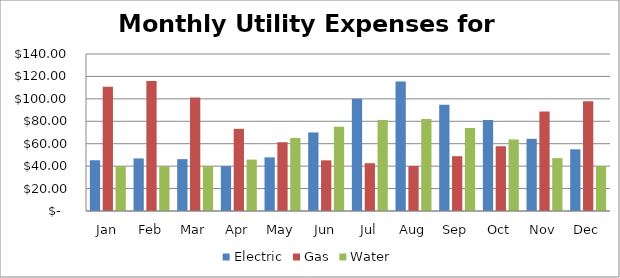
| Category | Electric | Gas | Water |
|---|---|---|---|
| Jan | 45.25 | 110.75 | 40 |
| Feb | 46.85 | 115.85 | 40 |
| Mar | 46.23 | 101.25 | 40 |
| Apr | 40 | 73.25 | 45.85 |
| May | 47.85 | 61.31 | 65.15 |
| Jun | 70.05 | 45.18 | 75.15 |
| Jul | 100.1 | 42.61 | 81.15 |
| Aug | 115.49 | 40.15 | 82.13 |
| Sep | 94.85 | 48.85 | 74 |
| Oct | 81.25 | 57.75 | 63.82 |
| Nov | 64.35 | 88.81 | 47.15 |
| Dec | 55 | 97.91 | 40 |